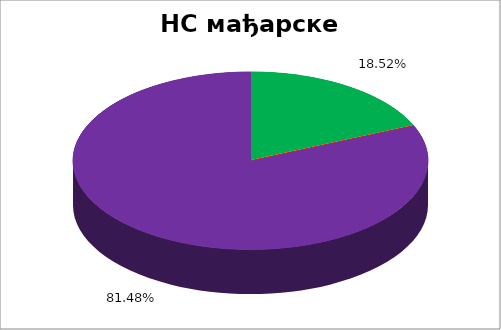
| Category | НС мађарске НМ |
|---|---|
| 0 | 0.185 |
| 1 | 0 |
| 2 | 0 |
| 3 | 0 |
| 4 | 0.815 |